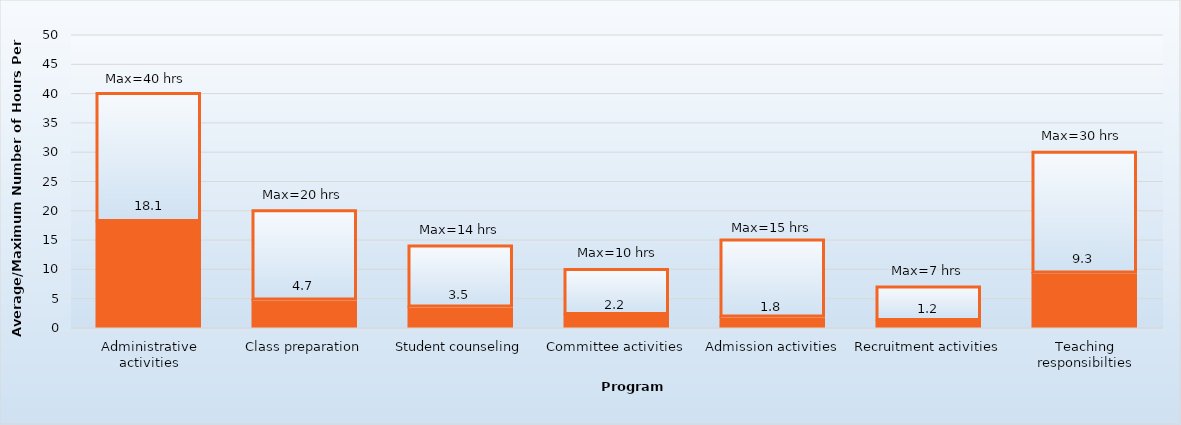
| Category | Average hours per week | Maximum |
|---|---|---|
| Administrative activities | 18.1 | 21.9 |
| Class preparation | 4.7 | 15.3 |
| Student counseling | 3.5 | 10.5 |
| Committee activities | 2.2 | 7.8 |
| Admission activities | 1.8 | 13.2 |
| Recruitment activities | 1.2 | 5.8 |
| Teaching responsibilties | 9.3 | 20.7 |